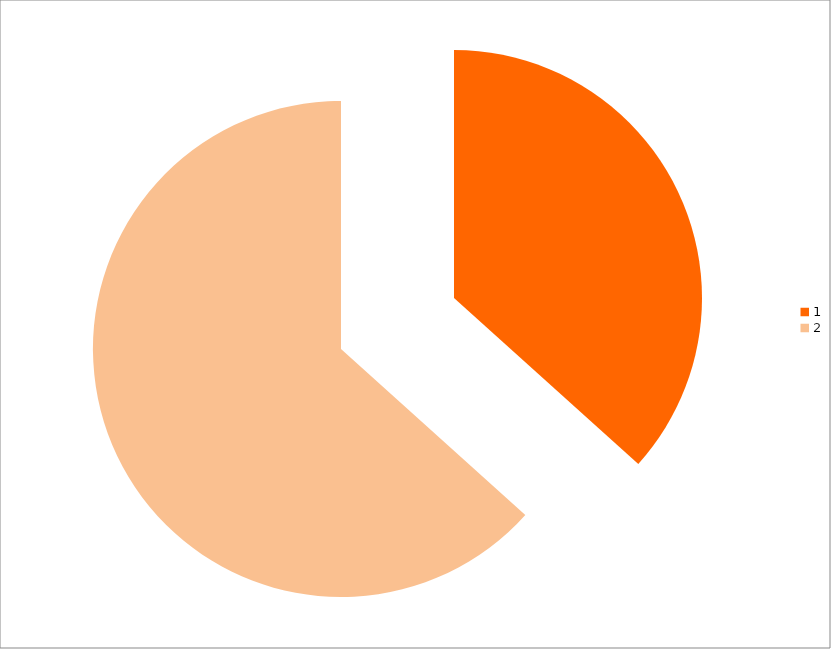
| Category | Series 0 |
|---|---|
| 0 | 22 |
| 1 | 38 |